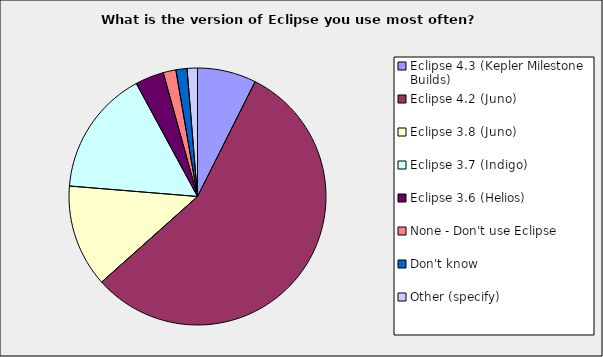
| Category | Series 0 |
|---|---|
| Eclipse 4.3 (Kepler Milestone Builds) | 0.074 |
| Eclipse 4.2 (Juno) | 0.56 |
| Eclipse 3.8 (Juno) | 0.129 |
| Eclipse 3.7 (Indigo) | 0.158 |
| Eclipse 3.6 (Helios) | 0.036 |
| None - Don't use Eclipse | 0.016 |
| Don't know | 0.014 |
| Other (specify) | 0.013 |